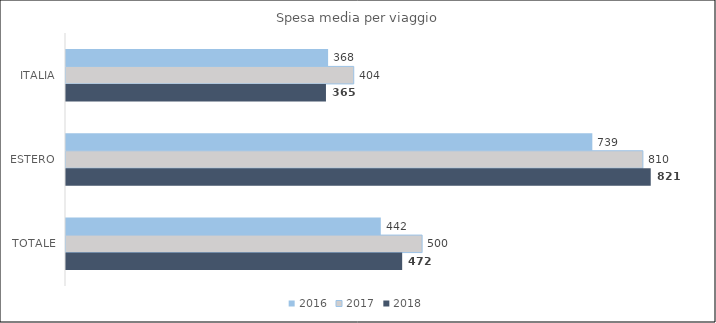
| Category | 2016 | 2017 | 2018 |
|---|---|---|---|
| ITALIA | 368 | 404 | 365 |
| ESTERO | 739 | 810 | 821 |
| TOTALE | 442 | 500 | 472 |